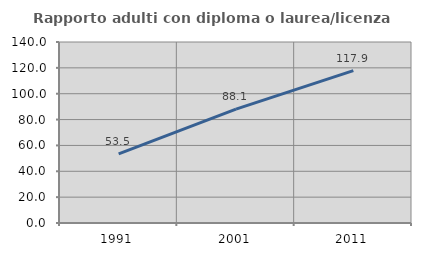
| Category | Rapporto adulti con diploma o laurea/licenza media  |
|---|---|
| 1991.0 | 53.521 |
| 2001.0 | 88.05 |
| 2011.0 | 117.852 |